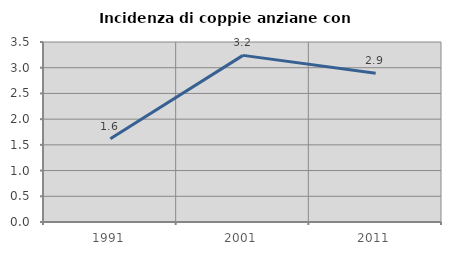
| Category | Incidenza di coppie anziane con figli |
|---|---|
| 1991.0 | 1.619 |
| 2001.0 | 3.24 |
| 2011.0 | 2.892 |